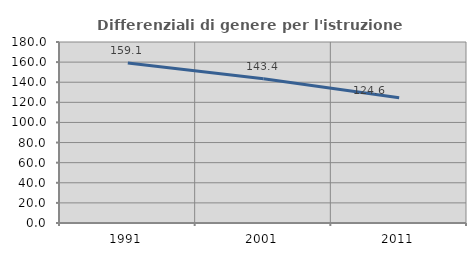
| Category | Differenziali di genere per l'istruzione superiore |
|---|---|
| 1991.0 | 159.091 |
| 2001.0 | 143.382 |
| 2011.0 | 124.636 |